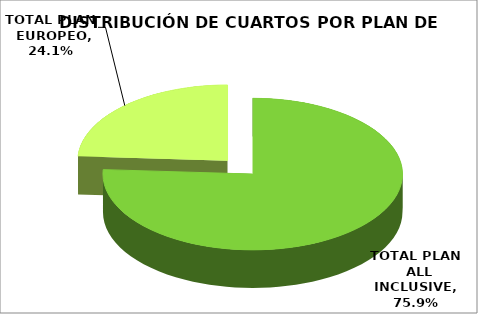
| Category | PLAN DE HOSPEDAJE |
|---|---|
| TOTAL PLAN  ALL INCLUSIVE | 0.759 |
| TOTAL PLAN  EUROPEO | 0.241 |